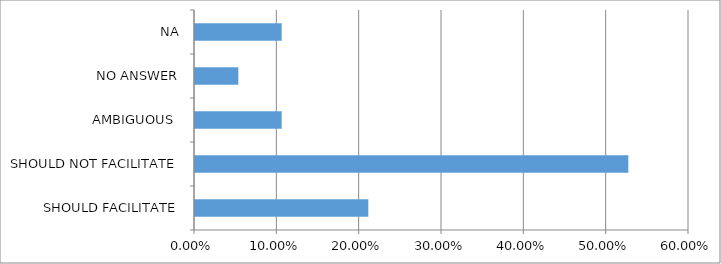
| Category | Series 0 |
|---|---|
| SHOULD FACILITATE | 0.211 |
| SHOULD NOT FACILITATE | 0.526 |
| AMBIGUOUS  | 0.105 |
| NO ANSWER | 0.053 |
| NA | 0.105 |